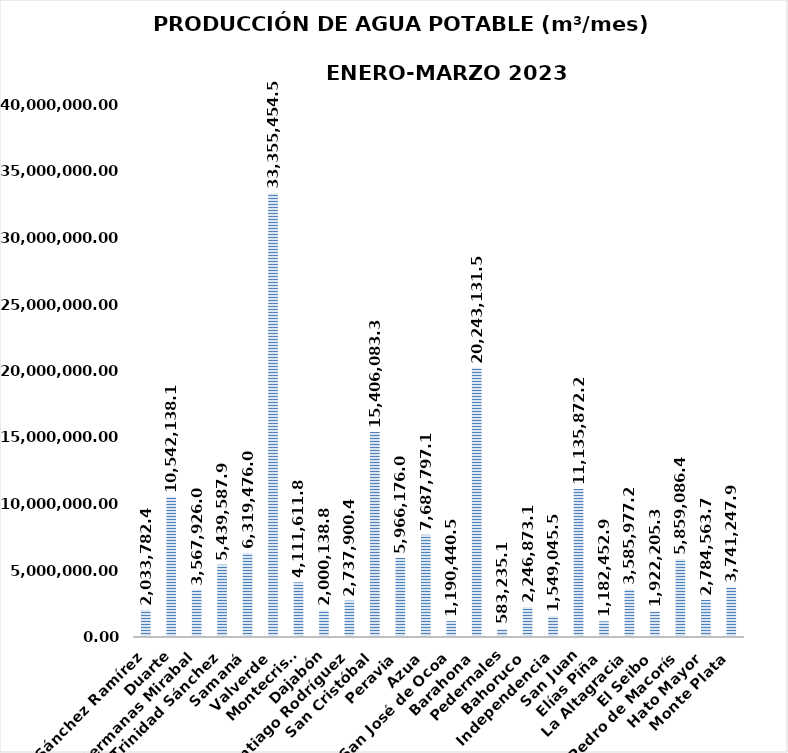
| Category | 2,033,782.45 |
|---|---|
| Sánchez Ramírez | 2033782.454 |
| Duarte | 10542138.142 |
| Hermanas Mirabal | 3567926.012 |
| María Trinidad Sánchez | 5439587.908 |
| Samaná | 6319476.074 |
| Valverde | 33355454.544 |
| Montecristi | 4111611.84 |
| Dajabón | 2000138.848 |
| Santiago Rodríguez | 2737900.462 |
| San Cristóbal | 15406083.377 |
| Peravia | 5966176.082 |
| Azua | 7687797.096 |
| San José de Ocoa | 1190440.512 |
| Barahona | 20243131.588 |
| Pedernales | 583235.14 |
| Bahoruco | 2246873.163 |
| Independencia | 1549045.542 |
| San Juan | 11135872.29 |
| Elías Piña | 1182452.98 |
| La Altagracia | 3585977.28 |
| El Seibo | 1922205.388 |
| San Pedro de Macorís | 5859086.4 |
| Hato Mayor | 2784563.712 |
| Monte Plata | 3741247.912 |